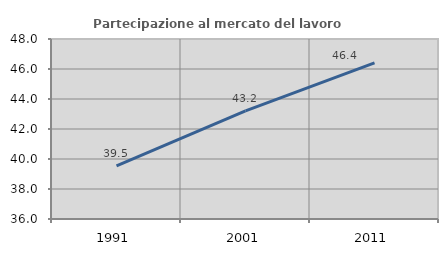
| Category | Partecipazione al mercato del lavoro  femminile |
|---|---|
| 1991.0 | 39.537 |
| 2001.0 | 43.203 |
| 2011.0 | 46.41 |